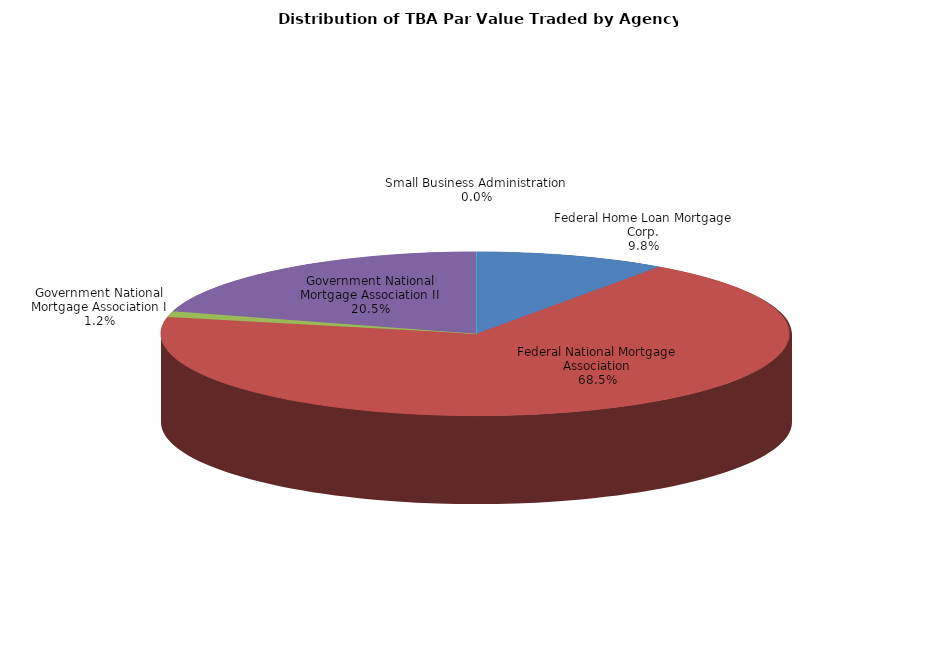
| Category | Series 0 |
|---|---|
| Federal Home Loan Mortgage Corp. | 19037674036.801 |
| Federal National Mortgage Association | 133235567000.901 |
| Government National Mortgage Association I | 2306099030.583 |
| Government National Mortgage Association II | 39962973697.273 |
| Small Business Administration | 7029272.615 |